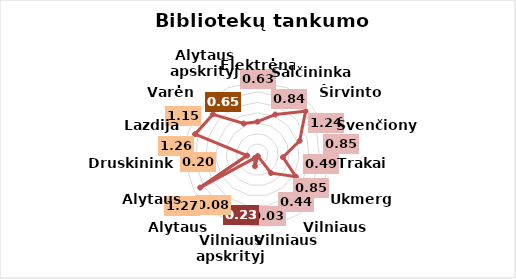
| Category | Series 0 |
|---|---|
| Elektrėnai | 0.63 |
| Šalčininkai | 0.84 |
| Širvintos | 1.24 |
| Švenčionys | 0.85 |
| Trakai | 0.49 |
| Ukmergė | 0.85 |
| Vilniaus r. | 0.44 |
| Vilniaus m. | 0.03 |
| Vilniaus apskrityje | 0.23 |
| Alytaus m. | 0.08 |
| Alytaus r. | 1.27 |
| Druskininkai | 0.2 |
| Lazdijai | 1.26 |
| Varėna | 1.15 |
| Alytaus apskrityje | 0.65 |